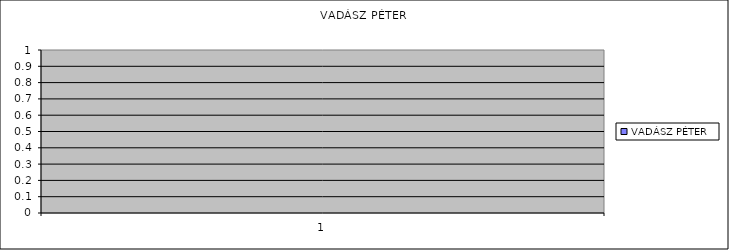
| Category | VADÁSZ PÉTER |
|---|---|
| 0 | 0 |